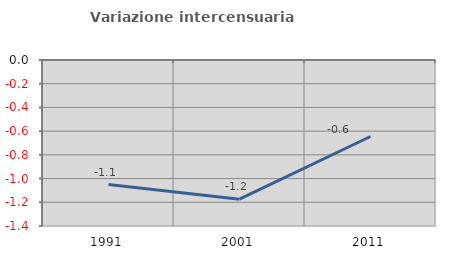
| Category | Variazione intercensuaria annua |
|---|---|
| 1991.0 | -1.05 |
| 2001.0 | -1.174 |
| 2011.0 | -0.645 |